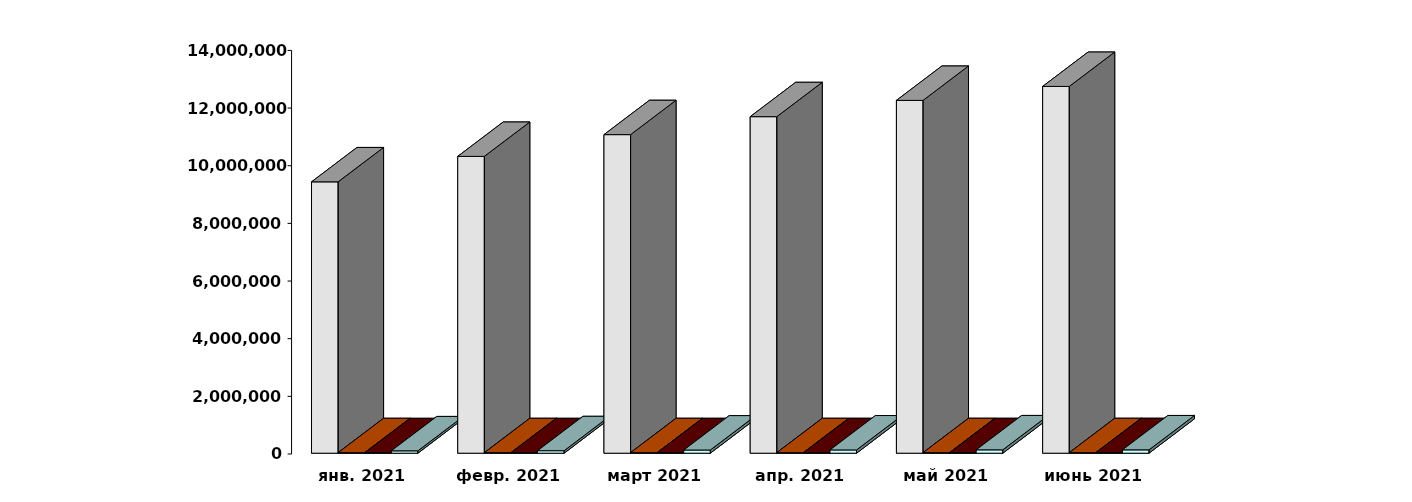
| Category | Физические лица | Юридические лица | Иностранные лица | Клиенты, передавшие свои средства в ДУ |
|---|---|---|---|---|
| 2021-01-28 | 9412672 | 19074 | 17041 | 82193 |
| 2021-02-28 | 10296032 | 19173 | 17445 | 86734 |
| 2021-03-30 | 11050505 | 19312 | 17990 | 110250 |
| 2021-04-30 | 11673527 | 19474 | 18437 | 113270 |
| 2021-05-30 | 12238639 | 19619 | 18804 | 116061 |
| 2021-06-30 | 12722884 | 19751 | 19280 | 115649 |